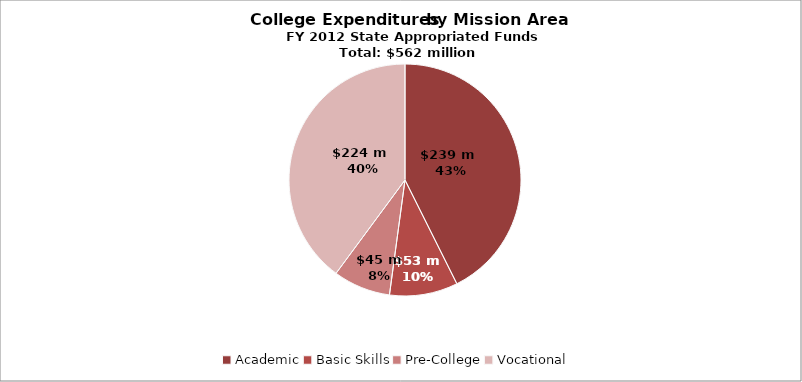
| Category | Series 0 |
|---|---|
| Academic | 239378033.065 |
| Basic Skills | 53449050.142 |
| Pre-College | 44854481.888 |
| Vocational | 223926015.954 |